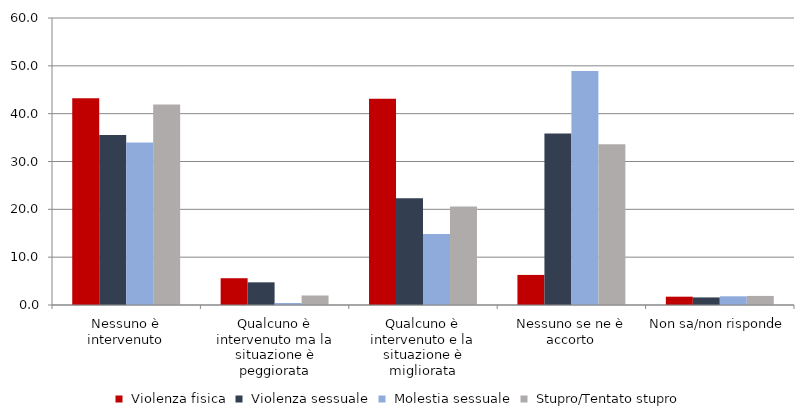
| Category | Series 0 | Series 1 | Series 2 | Series 3 |
|---|---|---|---|---|
| Nessuno è intervenuto | 43.233 | 35.542 | 33.974 | 41.937 |
| Qualcuno è intervenuto ma la situazione è peggiorata | 5.597 | 4.739 | 0.417 | 1.99 |
| Qualcuno è intervenuto e la situazione è migliorata | 43.141 | 22.307 | 14.869 | 20.568 |
| Nessuno se ne è accorto | 6.29 | 35.828 | 48.92 | 33.609 |
| Non sa/non risponde | 1.739 | 1.583 | 1.82 | 1.896 |